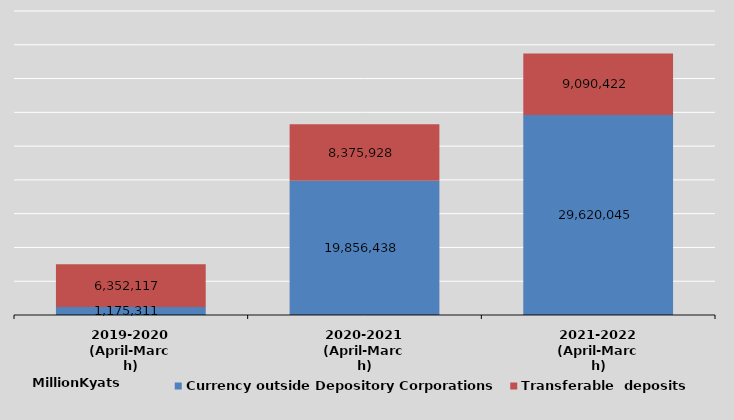
| Category | Currency outside Depository Corporations | Transferable  deposits |
|---|---|---|
| 2019-2020
(April-March) | 1175311 | 6352117 |
| 2020-2021
(April-March) | 19856438 | 8375928 |
| 2021-2022
(April-March) | 29620045 | 9090422 |